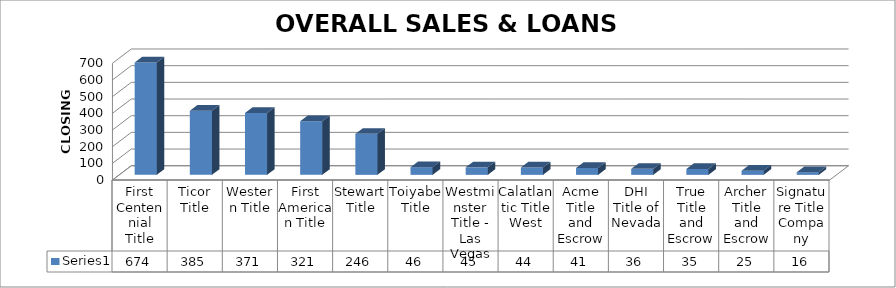
| Category | Series 0 |
|---|---|
| First Centennial Title | 674 |
| Ticor Title | 385 |
| Western Title | 371 |
| First American Title | 321 |
| Stewart Title | 246 |
| Toiyabe Title | 46 |
| Westminster Title - Las Vegas | 45 |
| Calatlantic Title West | 44 |
| Acme Title and Escrow | 41 |
| DHI Title of Nevada | 36 |
| True Title and Escrow | 35 |
| Archer Title and Escrow | 25 |
| Signature Title Company | 16 |